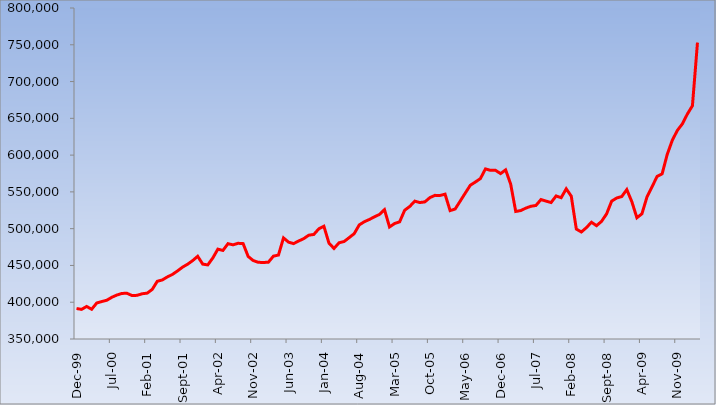
| Category | Total national government debt (R millions )    |
|---|---|
| 1999-12-01 | 391420 |
| 2000-01-01 | 390273 |
| 2000-02-01 | 394235 |
| 2000-03-01 | 390438 |
| 2000-04-01 | 398920 |
| 2000-05-01 | 400927 |
| 2000-06-01 | 402707 |
| 2000-07-01 | 406735 |
| 2000-08-01 | 409790 |
| 2000-09-01 | 411984 |
| 2000-10-01 | 412123 |
| 2000-11-01 | 409058 |
| 2000-12-01 | 409363 |
| 2001-01-01 | 411498 |
| 2001-02-01 | 412351 |
| 2001-03-01 | 417454 |
| 2001-04-01 | 428488 |
| 2001-05-01 | 430293 |
| 2001-06-01 | 434404 |
| 2001-07-01 | 437815 |
| 2001-08-01 | 442511 |
| 2001-09-01 | 447699 |
| 2001-10-01 | 451659 |
| 2001-11-01 | 456536 |
| 2001-12-01 | 462446 |
| 2002-01-01 | 451790 |
| 2002-02-01 | 450727 |
| 2002-03-01 | 460199 |
| 2002-04-01 | 472181 |
| 2002-05-01 | 470381 |
| 2002-06-01 | 479594 |
| 2002-07-01 | 478033 |
| 2002-08-01 | 480097 |
| 2002-09-01 | 479696 |
| 2002-10-01 | 462215 |
| 2002-11-01 | 456658 |
| 2002-12-01 | 454278 |
| 2003-01-01 | 454011 |
| 2003-02-01 | 454401 |
| 2003-03-01 | 462645 |
| 2003-04-01 | 464132 |
| 2003-05-01 | 487451 |
| 2003-06-01 | 481651 |
| 2003-07-01 | 479705 |
| 2003-08-01 | 483253 |
| 2003-09-01 | 486429 |
| 2003-10-01 | 491107 |
| 2003-11-01 | 492137 |
| 2003-12-01 | 499812 |
| 2004-01-01 | 503300 |
| 2004-02-01 | 480400 |
| 2004-03-01 | 473096 |
| 2004-04-01 | 480809 |
| 2004-05-01 | 482532 |
| 2004-06-01 | 487776 |
| 2004-07-01 | 493193 |
| 2004-08-01 | 505055 |
| 2004-09-01 | 509421 |
| 2004-10-01 | 512480 |
| 2004-11-01 | 516001 |
| 2004-12-01 | 519344 |
| 2005-01-01 | 525851 |
| 2005-02-01 | 502321 |
| 2005-03-01 | 506970 |
| 2005-04-01 | 509272 |
| 2005-05-01 | 525072 |
| 2005-06-01 | 530144 |
| 2005-07-01 | 537439 |
| 2005-08-01 | 535490 |
| 2005-09-01 | 536404 |
| 2005-10-01 | 542244 |
| 2005-11-01 | 545276 |
| 2005-12-01 | 545128 |
| 2006-01-01 | 546897 |
| 2006-02-01 | 524552 |
| 2006-03-01 | 526715 |
| 2006-04-01 | 537467 |
| 2006-05-01 | 548318 |
| 2006-06-01 | 559024 |
| 2006-07-01 | 563399 |
| 2006-08-01 | 568044 |
| 2006-09-01 | 581234 |
| 2006-10-01 | 579275 |
| 2006-11-01 | 579296 |
| 2006-12-01 | 574871 |
| 2007-01-01 | 579940 |
| 2007-02-01 | 560487 |
| 2007-03-01 | 523396 |
| 2007-04-01 | 524621 |
| 2007-05-01 | 527942 |
| 2007-06-01 | 530434 |
| 2007-07-01 | 531558 |
| 2007-08-01 | 539582 |
| 2007-09-01 | 537478 |
| 2007-10-01 | 535520 |
| 2007-11-01 | 544475 |
| 2007-12-01 | 542150 |
| 2008-01-01 | 554165 |
| 2008-02-01 | 544227 |
| 2008-03-01 | 499477 |
| 2008-04-01 | 495477 |
| 2008-05-01 | 501431 |
| 2008-06-01 | 508744 |
| 2008-07-01 | 504051 |
| 2008-08-01 | 509923 |
| 2008-09-01 | 520117 |
| 2008-10-01 | 537441 |
| 2008-11-01 | 541689 |
| 2008-12-01 | 543693 |
| 2009-01-01 | 553094 |
| 2009-02-01 | 536654 |
| 2009-03-01 | 514809 |
| 2009-04-01 | 520262 |
| 2009-05-01 | 543135 |
| 2009-06-01 | 556911 |
| 2009-07-01 | 571008 |
| 2009-08-01 | 574564 |
| 2009-09-01 | 600780 |
| 2009-10-01 | 619947 |
| 2009-11-01 | 633425 |
| 2009-12-01 | 642429 |
| 2010-01-01 | 655853 |
| 2010-02-01 | 667084 |
| 2010-03-01 | 752975 |